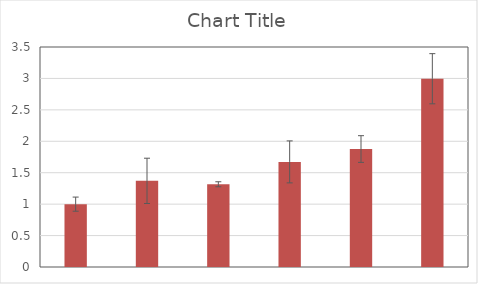
| Category | Series 1 |
|---|---|
| 0 | 1 |
| 1 | 1.371 |
| 2 | 1.316 |
| 3 | 1.672 |
| 4 | 1.877 |
| 5 | 2.995 |